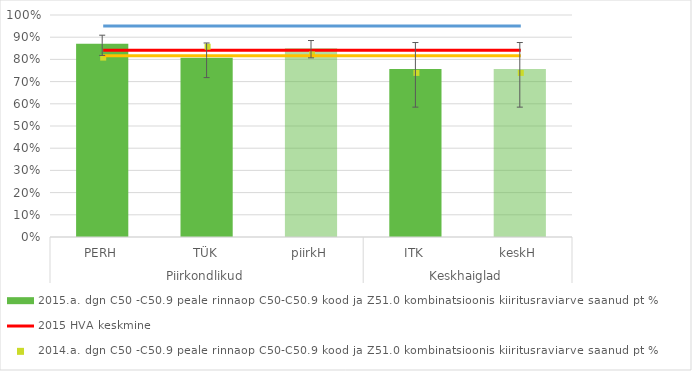
| Category | 2015.a. dgn C50 -C50.9 peale rinnaop C50-C50.9 kood ja Z51.0 kombinatsioonis kiiritusraviarve saanud pt % |
|---|---|
| 0 | 0.87 |
| 1 | 0.807 |
| 2 | 0.85 |
| 3 | 0.757 |
| 4 | 0.757 |